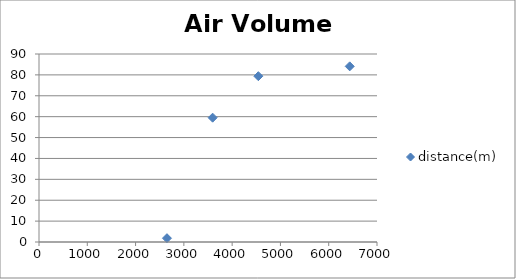
| Category | distance(m) |
|---|---|
| 6435.2 | 84.086 |
| 4542.494108 | 79.383 |
| 3596.141162 | 59.512 |
| 2649.788216 | 1.822 |